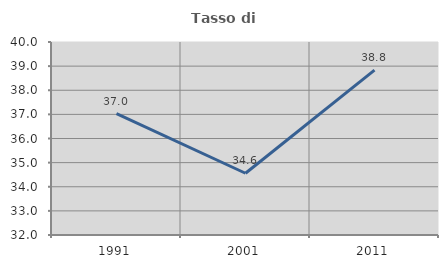
| Category | Tasso di occupazione   |
|---|---|
| 1991.0 | 37.029 |
| 2001.0 | 34.56 |
| 2011.0 | 38.833 |